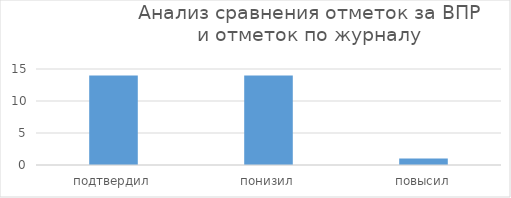
| Category | Series 0 |
|---|---|
| подтвердил | 14 |
| понизил | 14 |
| повысил | 1 |